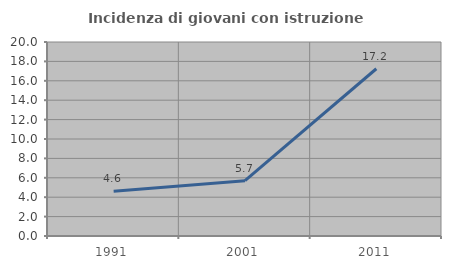
| Category | Incidenza di giovani con istruzione universitaria |
|---|---|
| 1991.0 | 4.615 |
| 2001.0 | 5.702 |
| 2011.0 | 17.241 |